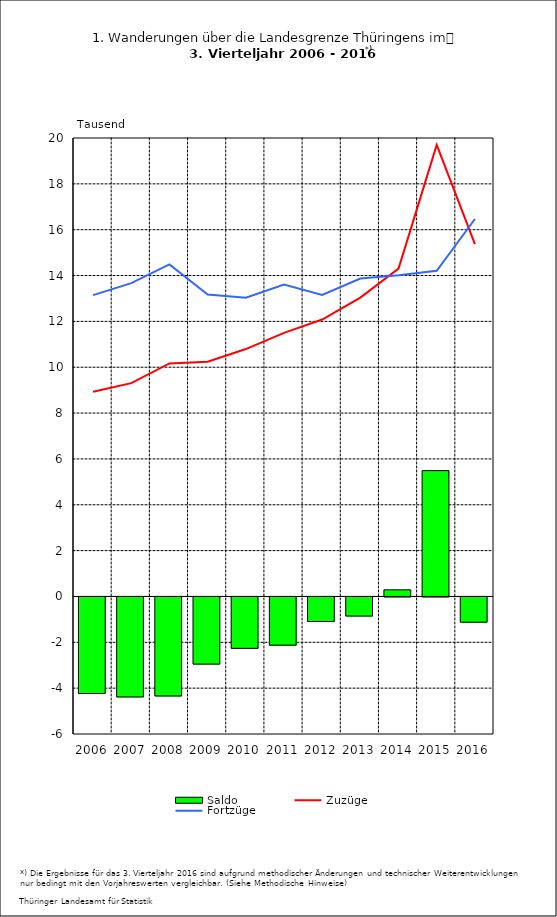
| Category | Saldo |
|---|---|
| 2006.0 | -4.213 |
| 2007.0 | -4.361 |
| 2008.0 | -4.319 |
| 2009.0 | -2.929 |
| 2010.0 | -2.242 |
| 2011.0 | -2.102 |
| 2012.0 | -1.071 |
| 2013.0 | -0.832 |
| 2014.0 | 0.29 |
| 2015.0 | 5.49 |
| 2016.0 | -1.1 |